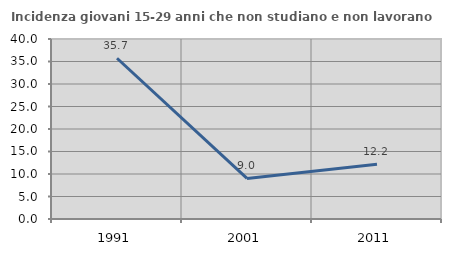
| Category | Incidenza giovani 15-29 anni che non studiano e non lavorano  |
|---|---|
| 1991.0 | 35.721 |
| 2001.0 | 9.008 |
| 2011.0 | 12.18 |